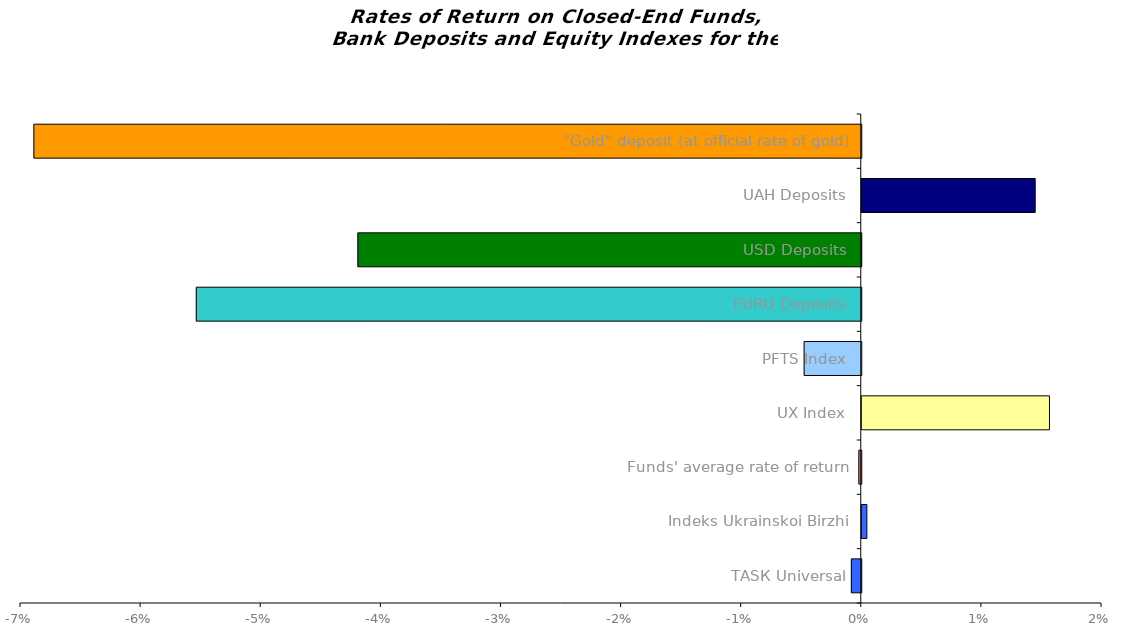
| Category | Series 0 |
|---|---|
| ТАSК Universal | -0.001 |
| Іndeks Ukrainskoi Birzhi | 0 |
| Funds' average rate of return | 0 |
| UX Index | 0.016 |
| PFTS Index | -0.005 |
| EURO Deposits | -0.055 |
| USD Deposits | -0.042 |
| UAH Deposits | 0.014 |
| "Gold" deposit (at official rate of gold) | -0.069 |